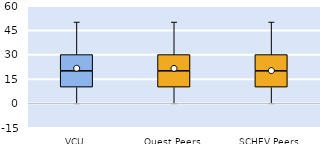
| Category | 25th | 50th | 75th |
|---|---|---|---|
| VCU | 10 | 10 | 10 |
| Quest Peers | 10 | 10 | 10 |
| SCHEV Peers | 10 | 10 | 10 |